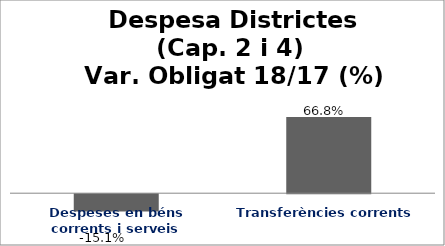
| Category | Series 0 |
|---|---|
| Despeses en béns corrents i serveis | -0.151 |
| Transferències corrents | 0.668 |